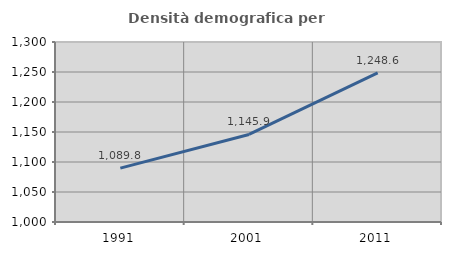
| Category | Densità demografica |
|---|---|
| 1991.0 | 1089.761 |
| 2001.0 | 1145.876 |
| 2011.0 | 1248.583 |